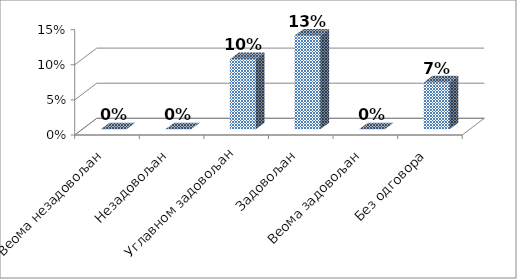
| Category | Series 0 |
|---|---|
| Веома незадовољан | 0 |
| Незадовољан | 0 |
| Углавном задовољан | 0.1 |
| Задовољан | 0.133 |
| Веома задовољан | 0 |
| Без одговора | 0.067 |